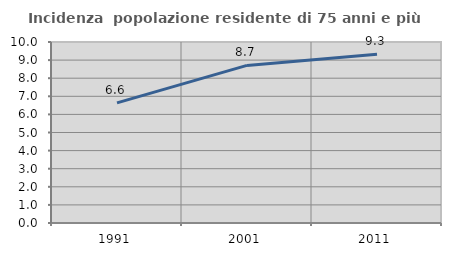
| Category | Incidenza  popolazione residente di 75 anni e più |
|---|---|
| 1991.0 | 6.639 |
| 2001.0 | 8.706 |
| 2011.0 | 9.319 |